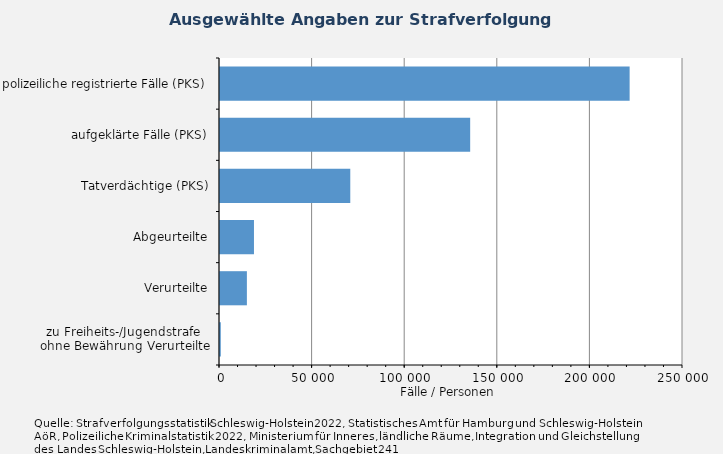
| Category | Fälle/Personen |
|---|---|
| zu Freiheits-/Jugendstrafe 
ohne Bewährung Verurteilte | 420 |
| Verurteilte | 14519 |
| Abgeurteilte | 18342 |
| Tatverdächtige (PKS) | 70344 |
| aufgeklärte Fälle (PKS) | 135084 |
| polizeiliche registrierte Fälle (PKS) | 221183 |